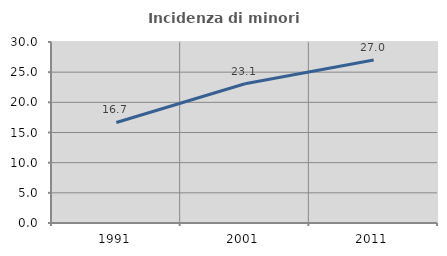
| Category | Incidenza di minori stranieri |
|---|---|
| 1991.0 | 16.667 |
| 2001.0 | 23.077 |
| 2011.0 | 27.027 |